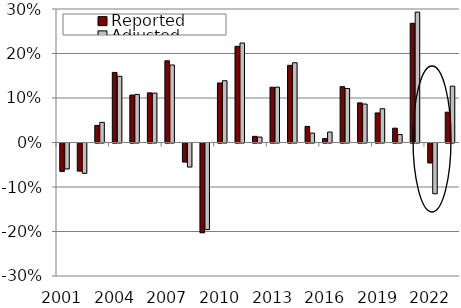
| Category | Reported | Adjusted |
|---|---|---|
| 2001.0 | -0.064 | -0.058 |
| 2002.0 | -0.063 | -0.068 |
| 2003.0 | 0.038 | 0.045 |
| 2004.0 | 0.158 | 0.149 |
| 2005.0 | 0.107 | 0.108 |
| 2006.0 | 0.112 | 0.111 |
| 2007.0 | 0.184 | 0.174 |
| 2008.0 | -0.042 | -0.054 |
| 2009.0 | -0.201 | -0.195 |
| 2010.0 | 0.134 | 0.139 |
| 2011.0 | 0.216 | 0.224 |
| 2012.0 | 0.014 | 0.012 |
| 2013.0 | 0.124 | 0.124 |
| 2014.0 | 0.173 | 0.179 |
| 2015.0 | 0.036 | 0.021 |
| 2016.0 | 0.009 | 0.024 |
| 2017.0 | 0.125 | 0.121 |
| 2018.0 | 0.089 | 0.086 |
| 2019.0 | 0.066 | 0.076 |
| 2020.0 | 0.032 | 0.018 |
| 2021.0 | 0.268 | 0.293 |
| 2022.0 | -0.045 | -0.114 |
| 2023.0 | 0.068 | 0.127 |